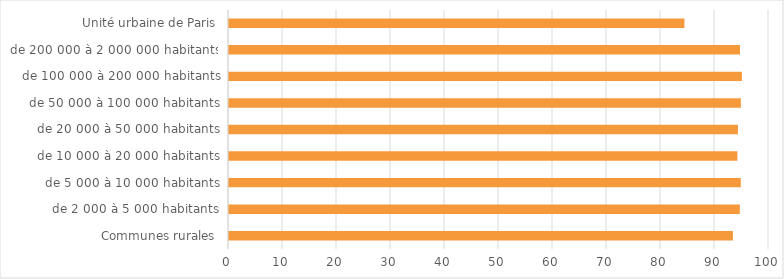
| Category | Département d'enregistrement = département de commission (%) |
|---|---|
| Communes rurales | 93.32 |
| de 2 000 à 5 000 habitants | 94.593 |
| de 5 000 à 10 000 habitants | 94.775 |
| de 10 000 à 20 000 habitants | 94.143 |
| de 20 000 à 50 000 habitants | 94.247 |
| de 50 000 à 100 000 habitants | 94.79 |
| de 100 000 à 200 000 habitants | 94.984 |
| de 200 000 à 2 000 000 habitants | 94.629 |
| Unité urbaine de Paris | 84.339 |